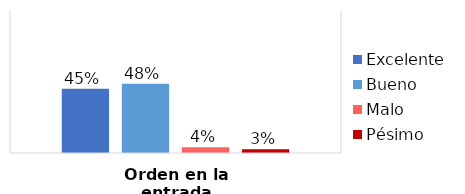
| Category | Excelente | Bueno | Malo | Pésimo |
|---|---|---|---|---|
| Orden en la entrada | 0.449 | 0.485 | 0.041 | 0.026 |